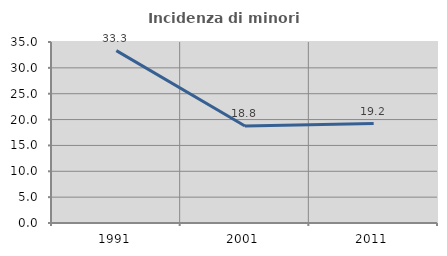
| Category | Incidenza di minori stranieri |
|---|---|
| 1991.0 | 33.333 |
| 2001.0 | 18.75 |
| 2011.0 | 19.231 |